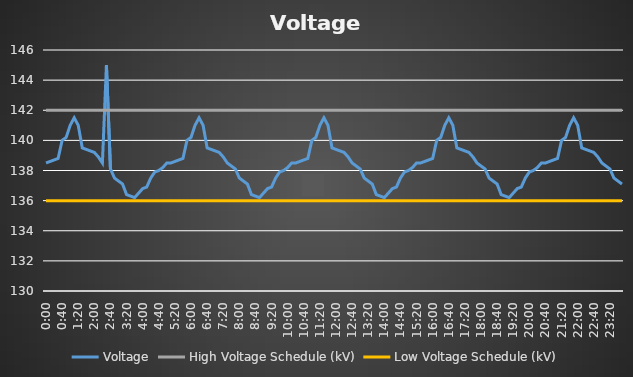
| Category | Voltage | High Voltage Schedule (kV) | Low Voltage Schedule (kV) |
|---|---|---|---|
| 0.0 | 138.5 | 142 | 136 |
| 0.006944444444444444 | 138.6 | 142 | 136 |
| 0.013888888888888888 | 138.7 | 142 | 136 |
| 0.0208333333333333 | 138.8 | 142 | 136 |
| 0.0277777777777777 | 140 | 142 | 136 |
| 0.0347222222222222 | 140.2 | 142 | 136 |
| 0.0416666666666666 | 141 | 142 | 136 |
| 0.0486111111111111 | 141.5 | 142 | 136 |
| 0.0555555555555555 | 141 | 142 | 136 |
| 0.0625 | 139.5 | 142 | 136 |
| 0.0694444444444444 | 139.4 | 142 | 136 |
| 0.0763888888888889 | 139.3 | 142 | 136 |
| 0.0833333333333333 | 139.2 | 142 | 136 |
| 0.0902777777777777 | 138.9 | 142 | 136 |
| 0.0972222222222223 | 138.5 | 142 | 136 |
| 0.104166666666667 | 145 | 142 | 136 |
| 0.111111111111111 | 138.1 | 142 | 136 |
| 0.118055555555555 | 137.5 | 142 | 136 |
| 0.125 | 137.3 | 142 | 136 |
| 0.131944444444444 | 137.1 | 142 | 136 |
| 0.138888888888888 | 136.4 | 142 | 136 |
| 0.145833333333333 | 136.3 | 142 | 136 |
| 0.152777777777777 | 136.2 | 142 | 136 |
| 0.159722222222222 | 136.5 | 142 | 136 |
| 0.166666666666666 | 136.8 | 142 | 136 |
| 0.173611111111111 | 136.9 | 142 | 136 |
| 0.180555555555555 | 137.5 | 142 | 136 |
| 0.1875 | 137.9 | 142 | 136 |
| 0.194444444444444 | 138 | 142 | 136 |
| 0.201388888888888 | 138.2 | 142 | 136 |
| 0.208333333333333 | 138.5 | 142 | 136 |
| 0.215277777777777 | 138.5 | 142 | 136 |
| 0.222222222222222 | 138.6 | 142 | 136 |
| 0.229166666666666 | 138.7 | 142 | 136 |
| 0.236111111111111 | 138.8 | 142 | 136 |
| 0.243055555555555 | 140 | 142 | 136 |
| 0.25 | 140.2 | 142 | 136 |
| 0.256944444444444 | 141 | 142 | 136 |
| 0.263888888888888 | 141.5 | 142 | 136 |
| 0.270833333333333 | 141 | 142 | 136 |
| 0.277777777777777 | 139.5 | 142 | 136 |
| 0.284722222222222 | 139.4 | 142 | 136 |
| 0.291666666666666 | 139.3 | 142 | 136 |
| 0.298611111111111 | 139.2 | 142 | 136 |
| 0.305555555555555 | 138.9 | 142 | 136 |
| 0.3125 | 138.5 | 142 | 136 |
| 0.319444444444444 | 138.3 | 142 | 136 |
| 0.326388888888888 | 138.1 | 142 | 136 |
| 0.333333333333333 | 137.5 | 142 | 136 |
| 0.340277777777777 | 137.3 | 142 | 136 |
| 0.347222222222222 | 137.1 | 142 | 136 |
| 0.354166666666666 | 136.4 | 142 | 136 |
| 0.361111111111111 | 136.3 | 142 | 136 |
| 0.368055555555555 | 136.2 | 142 | 136 |
| 0.375 | 136.5 | 142 | 136 |
| 0.381944444444444 | 136.8 | 142 | 136 |
| 0.388888888888888 | 136.9 | 142 | 136 |
| 0.395833333333333 | 137.5 | 142 | 136 |
| 0.402777777777777 | 137.9 | 142 | 136 |
| 0.409722222222222 | 138 | 142 | 136 |
| 0.416666666666666 | 138.2 | 142 | 136 |
| 0.423611111111111 | 138.5 | 142 | 136 |
| 0.430555555555555 | 138.5 | 142 | 136 |
| 0.4375 | 138.6 | 142 | 136 |
| 0.444444444444444 | 138.7 | 142 | 136 |
| 0.451388888888888 | 138.8 | 142 | 136 |
| 0.458333333333333 | 140 | 142 | 136 |
| 0.465277777777777 | 140.2 | 142 | 136 |
| 0.472222222222222 | 141 | 142 | 136 |
| 0.479166666666666 | 141.5 | 142 | 136 |
| 0.486111111111111 | 141 | 142 | 136 |
| 0.493055555555555 | 139.5 | 142 | 136 |
| 0.5 | 139.4 | 142 | 136 |
| 0.506944444444444 | 139.3 | 142 | 136 |
| 0.513888888888888 | 139.2 | 142 | 136 |
| 0.520833333333333 | 138.9 | 142 | 136 |
| 0.527777777777777 | 138.5 | 142 | 136 |
| 0.534722222222222 | 138.3 | 142 | 136 |
| 0.541666666666666 | 138.1 | 142 | 136 |
| 0.548611111111111 | 137.5 | 142 | 136 |
| 0.555555555555555 | 137.3 | 142 | 136 |
| 0.5625 | 137.1 | 142 | 136 |
| 0.569444444444444 | 136.4 | 142 | 136 |
| 0.576388888888888 | 136.3 | 142 | 136 |
| 0.583333333333333 | 136.2 | 142 | 136 |
| 0.590277777777777 | 136.5 | 142 | 136 |
| 0.597222222222222 | 136.8 | 142 | 136 |
| 0.604166666666666 | 136.9 | 142 | 136 |
| 0.611111111111111 | 137.5 | 142 | 136 |
| 0.618055555555555 | 137.9 | 142 | 136 |
| 0.624999999999999 | 138 | 142 | 136 |
| 0.631944444444444 | 138.2 | 142 | 136 |
| 0.638888888888888 | 138.5 | 142 | 136 |
| 0.645833333333333 | 138.5 | 142 | 136 |
| 0.652777777777777 | 138.6 | 142 | 136 |
| 0.659722222222222 | 138.7 | 142 | 136 |
| 0.666666666666666 | 138.8 | 142 | 136 |
| 0.673611111111111 | 140 | 142 | 136 |
| 0.680555555555555 | 140.2 | 142 | 136 |
| 0.687499999999999 | 141 | 142 | 136 |
| 0.694444444444444 | 141.5 | 142 | 136 |
| 0.701388888888888 | 141 | 142 | 136 |
| 0.708333333333333 | 139.5 | 142 | 136 |
| 0.715277777777777 | 139.4 | 142 | 136 |
| 0.722222222222222 | 139.3 | 142 | 136 |
| 0.729166666666666 | 139.2 | 142 | 136 |
| 0.736111111111111 | 138.9 | 142 | 136 |
| 0.743055555555555 | 138.5 | 142 | 136 |
| 0.749999999999999 | 138.3 | 142 | 136 |
| 0.756944444444444 | 138.1 | 142 | 136 |
| 0.763888888888888 | 137.5 | 142 | 136 |
| 0.770833333333333 | 137.3 | 142 | 136 |
| 0.777777777777777 | 137.1 | 142 | 136 |
| 0.784722222222222 | 136.4 | 142 | 136 |
| 0.791666666666666 | 136.3 | 142 | 136 |
| 0.798611111111111 | 136.2 | 142 | 136 |
| 0.805555555555555 | 136.5 | 142 | 136 |
| 0.812499999999999 | 136.8 | 142 | 136 |
| 0.819444444444444 | 136.9 | 142 | 136 |
| 0.826388888888888 | 137.5 | 142 | 136 |
| 0.833333333333333 | 137.9 | 142 | 136 |
| 0.840277777777777 | 138 | 142 | 136 |
| 0.847222222222222 | 138.2 | 142 | 136 |
| 0.854166666666666 | 138.5 | 142 | 136 |
| 0.861111111111111 | 138.5 | 142 | 136 |
| 0.868055555555555 | 138.6 | 142 | 136 |
| 0.874999999999999 | 138.7 | 142 | 136 |
| 0.881944444444444 | 138.8 | 142 | 136 |
| 0.888888888888888 | 140 | 142 | 136 |
| 0.895833333333333 | 140.2 | 142 | 136 |
| 0.902777777777777 | 141 | 142 | 136 |
| 0.909722222222222 | 141.5 | 142 | 136 |
| 0.916666666666666 | 141 | 142 | 136 |
| 0.923611111111111 | 139.5 | 142 | 136 |
| 0.930555555555555 | 139.4 | 142 | 136 |
| 0.937499999999999 | 139.3 | 142 | 136 |
| 0.944444444444444 | 139.2 | 142 | 136 |
| 0.951388888888888 | 138.9 | 142 | 136 |
| 0.958333333333333 | 138.5 | 142 | 136 |
| 0.965277777777777 | 138.3 | 142 | 136 |
| 0.972222222222222 | 138.1 | 142 | 136 |
| 0.979166666666666 | 137.5 | 142 | 136 |
| 0.986111111111111 | 137.3 | 142 | 136 |
| 0.993055555555555 | 137.1 | 142 | 136 |